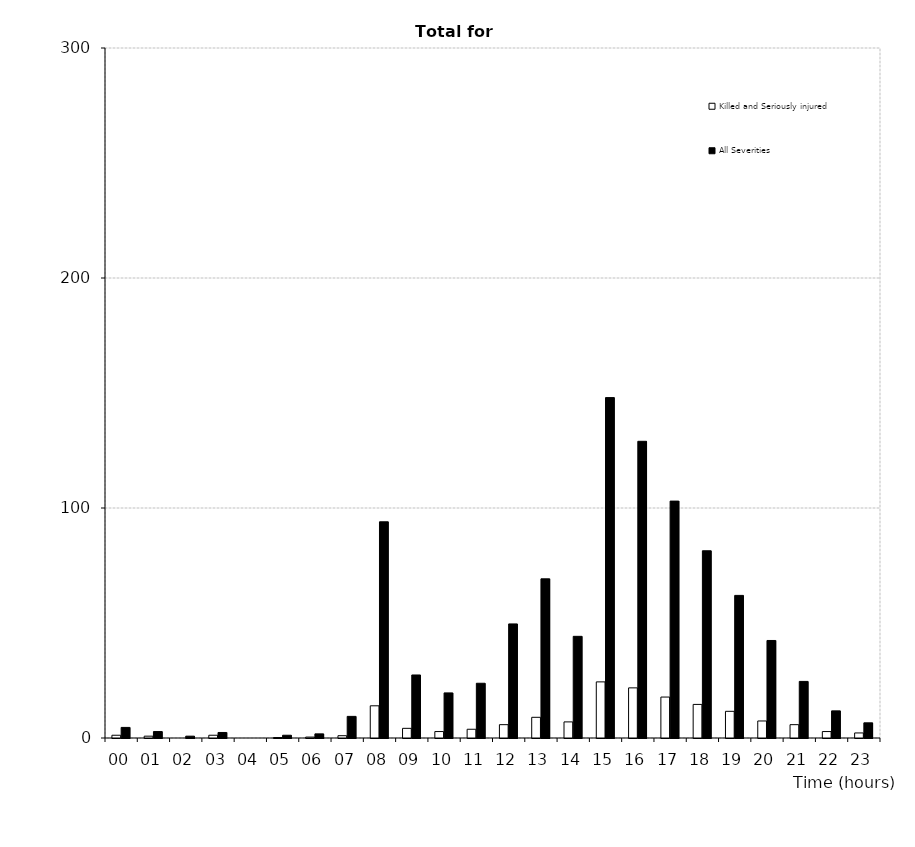
| Category | Killed and Seriously injured | All Severities |
|---|---|---|
| 00 | 1.2 | 4.6 |
| 01 | 0.8 | 2.8 |
| 02 | 0 | 0.8 |
| 03 | 1.2 | 2.4 |
| 04 | 0 | 0 |
| 05 | 0.2 | 1.2 |
| 06 | 0.4 | 1.8 |
| 07 | 1 | 9.4 |
| 08 | 14 | 94 |
| 09 | 4.2 | 27.4 |
| 10 | 2.8 | 19.6 |
| 11 | 3.8 | 23.8 |
| 12 | 5.8 | 49.6 |
| 13 | 9 | 69.2 |
| 14 | 7 | 44.2 |
| 15 | 24.4 | 148 |
| 16 | 21.8 | 129 |
| 17 | 17.8 | 103 |
| 18 | 14.6 | 81.4 |
| 19 | 11.6 | 62 |
| 20 | 7.4 | 42.4 |
| 21 | 5.8 | 24.6 |
| 22 | 2.8 | 11.8 |
| 23 | 2.2 | 6.6 |